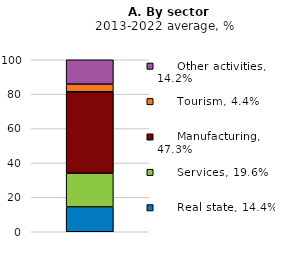
| Category |      Real state, 14.4% |      Services, 19.6% |      Manufacturing, 47.3% |      Tourism, 4.4% |      Other activities, 14.2% |
|---|---|---|---|---|---|
|  | 14.441 | 19.641 | 47.305 | 4.426 | 14.187 |